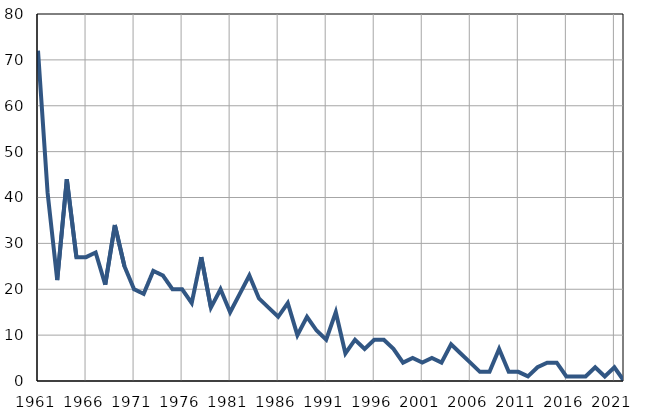
| Category | Infants
deaths |
|---|---|
| 1961.0 | 72 |
| 1962.0 | 41 |
| 1963.0 | 22 |
| 1964.0 | 44 |
| 1965.0 | 27 |
| 1966.0 | 27 |
| 1967.0 | 28 |
| 1968.0 | 21 |
| 1969.0 | 34 |
| 1970.0 | 25 |
| 1971.0 | 20 |
| 1972.0 | 19 |
| 1973.0 | 24 |
| 1974.0 | 23 |
| 1975.0 | 20 |
| 1976.0 | 20 |
| 1977.0 | 17 |
| 1978.0 | 27 |
| 1979.0 | 16 |
| 1980.0 | 20 |
| 1981.0 | 15 |
| 1982.0 | 19 |
| 1983.0 | 23 |
| 1984.0 | 18 |
| 1985.0 | 16 |
| 1986.0 | 14 |
| 1987.0 | 17 |
| 1988.0 | 10 |
| 1989.0 | 14 |
| 1990.0 | 11 |
| 1991.0 | 9 |
| 1992.0 | 15 |
| 1993.0 | 6 |
| 1994.0 | 9 |
| 1995.0 | 7 |
| 1996.0 | 9 |
| 1997.0 | 9 |
| 1998.0 | 7 |
| 1999.0 | 4 |
| 2000.0 | 5 |
| 2001.0 | 4 |
| 2002.0 | 5 |
| 2003.0 | 4 |
| 2004.0 | 8 |
| 2005.0 | 6 |
| 2006.0 | 4 |
| 2007.0 | 2 |
| 2008.0 | 2 |
| 2009.0 | 7 |
| 2010.0 | 2 |
| 2011.0 | 2 |
| 2012.0 | 1 |
| 2013.0 | 3 |
| 2014.0 | 4 |
| 2015.0 | 4 |
| 2016.0 | 1 |
| 2017.0 | 1 |
| 2018.0 | 1 |
| 2019.0 | 3 |
| 2020.0 | 1 |
| 2021.0 | 3 |
| 2022.0 | 0 |